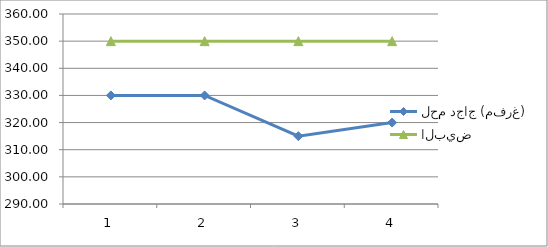
| Category | لحم دجاج (مفرغ) | البيض |
|---|---|---|
| 0 | 330 | 350 |
| 1 | 330 | 350 |
| 2 | 315 | 350 |
| 3 | 320 | 350 |